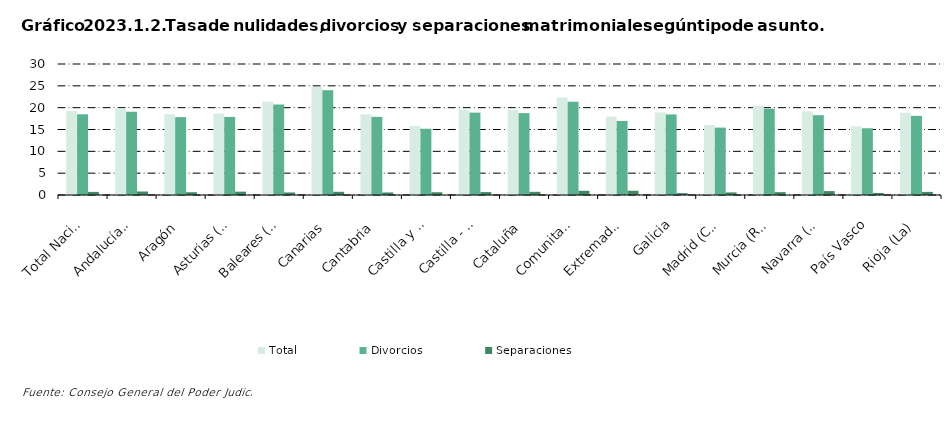
| Category | Total | Divorcios | Separaciones |
|---|---|---|---|
| Total Nacional | 19.204 | 18.485 | 0.709 |
| Andalucía(1) | 19.877 | 19.067 | 0.801 |
| Aragón | 18.49 | 17.834 | 0.634 |
| Asturias (Principado de) | 18.657 | 17.882 | 0.765 |
| Baleares (Illes) | 21.332 | 20.729 | 0.587 |
| Canarias | 24.731 | 23.985 | 0.737 |
| Cantabria | 18.474 | 17.896 | 0.578 |
| Castilla y León | 15.812 | 15.174 | 0.633 |
| Castilla - La Mancha | 19.539 | 18.862 | 0.667 |
| Cataluña | 19.486 | 18.75 | 0.729 |
| Comunitat Valenciana | 22.321 | 21.337 | 0.964 |
| Extremadura | 17.936 | 16.959 | 0.977 |
| Galicia | 18.904 | 18.448 | 0.43 |
| Madrid (Comunidad de) | 16.033 | 15.434 | 0.589 |
| Murcia (Región de) | 20.442 | 19.778 | 0.657 |
| Navarra (Comunidad Foral de) | 19.162 | 18.27 | 0.893 |
| País Vasco | 15.733 | 15.282 | 0.447 |
| Rioja (La) | 18.834 | 18.121 | 0.714 |